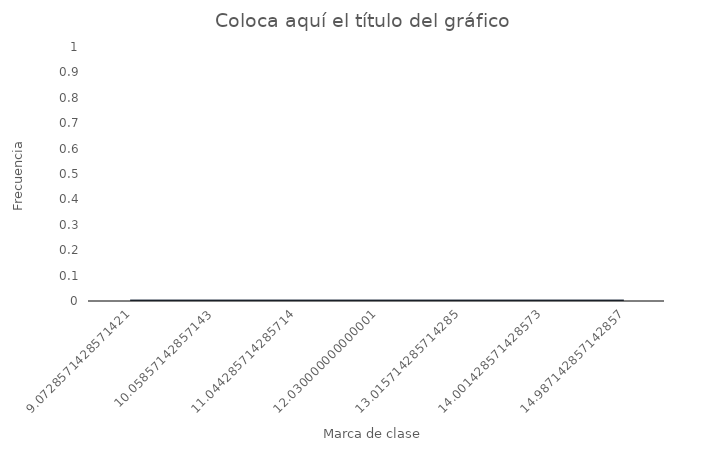
| Category | Series 0 |
|---|---|
| 9.072857142857142 | 6 |
| 10.05857142857143 | 5 |
| 11.044285714285714 | 6 |
| 12.030000000000001 | 10 |
| 13.015714285714285 | 8 |
| 14.001428571428573 | 8 |
| 14.987142857142857 | 7 |